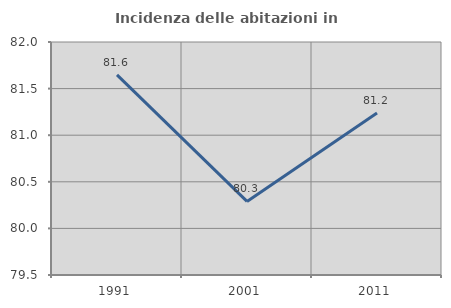
| Category | Incidenza delle abitazioni in proprietà  |
|---|---|
| 1991.0 | 81.648 |
| 2001.0 | 80.289 |
| 2011.0 | 81.239 |